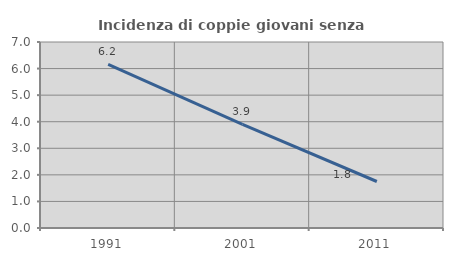
| Category | Incidenza di coppie giovani senza figli |
|---|---|
| 1991.0 | 6.158 |
| 2001.0 | 3.902 |
| 2011.0 | 1.75 |